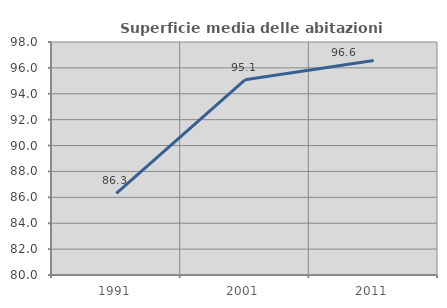
| Category | Superficie media delle abitazioni occupate |
|---|---|
| 1991.0 | 86.3 |
| 2001.0 | 95.08 |
| 2011.0 | 96.573 |